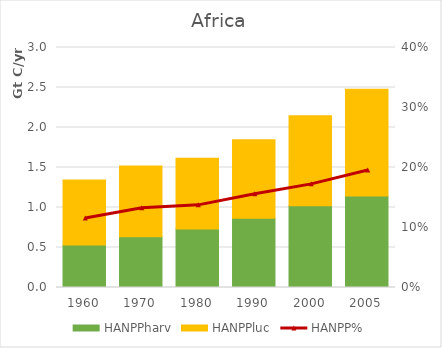
| Category | HANPPharv | HANPPluc |
|---|---|---|
| 1960.0 | 532310.44 | 811134.879 |
| 1970.0 | 634674.601 | 885339.12 |
| 1980.0 | 732750.166 | 883986.692 |
| 1990.0 | 865931.772 | 980921.783 |
| 2000.0 | 1022645.741 | 1125038.214 |
| 2005.0 | 1144149.533 | 1334447.437 |